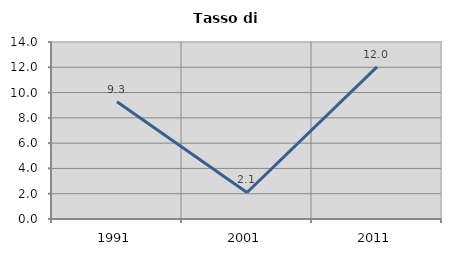
| Category | Tasso di disoccupazione   |
|---|---|
| 1991.0 | 9.272 |
| 2001.0 | 2.098 |
| 2011.0 | 12.03 |